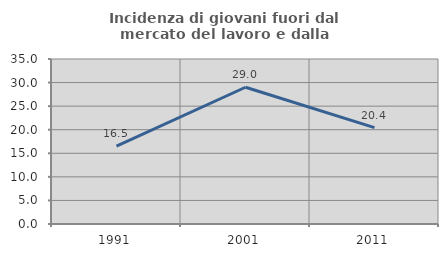
| Category | Incidenza di giovani fuori dal mercato del lavoro e dalla formazione  |
|---|---|
| 1991.0 | 16.505 |
| 2001.0 | 29.01 |
| 2011.0 | 20.43 |